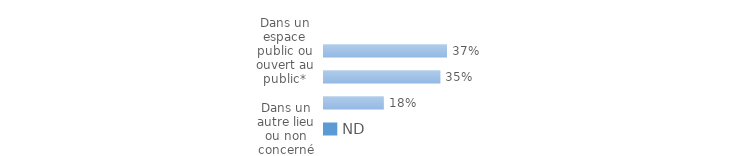
| Category | Series 0 |
|---|---|
| Dans un espace public ou ouvert au public* | 0.37 |
| Sur le lieu de travail ou d'études  | 0.35 |
| Dans une habitation (domicile ou immeuble de la victime, domicile d'une autre personne) | 0.18 |
| Dans un autre lieu ou non concerné | 0.04 |